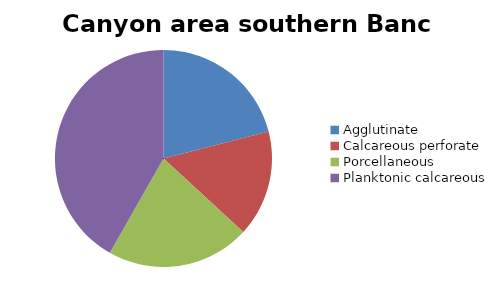
| Category | Canyon area southern Banc d'Arguin |
|---|---|
| ﻿Agglutinate | 21.013 |
| Calcareous perforate | 15.843 |
| Porcellaneous | 21.377 |
| Planktonic calcareous | 41.766 |